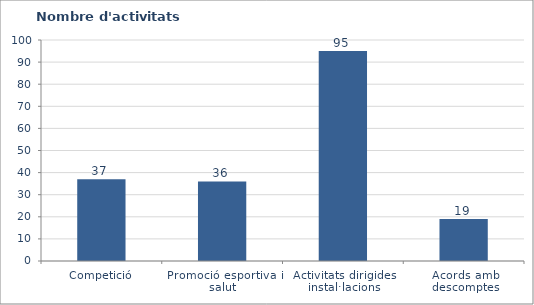
| Category | Nombre d'activitats ofertades |
|---|---|
| Competició | 37 |
| Promoció esportiva i salut | 36 |
| Activitats dirigides instal·lacions | 95 |
| Acords amb descomptes | 19 |